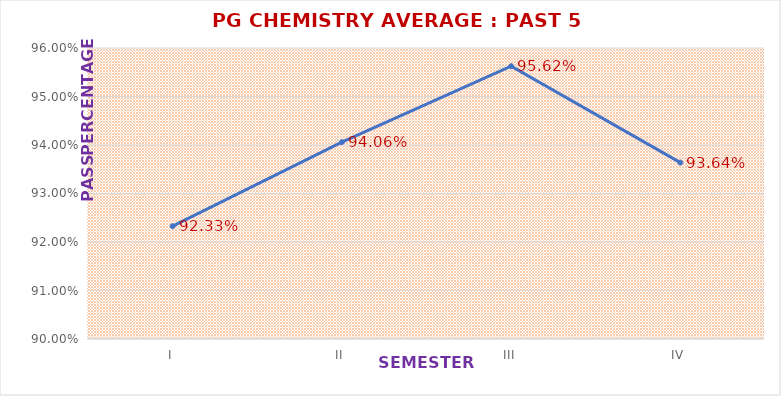
| Category | PG CHEMISTRY |
|---|---|
| I | 0.923 |
| II | 0.941 |
| III | 0.956 |
| IV | 0.936 |